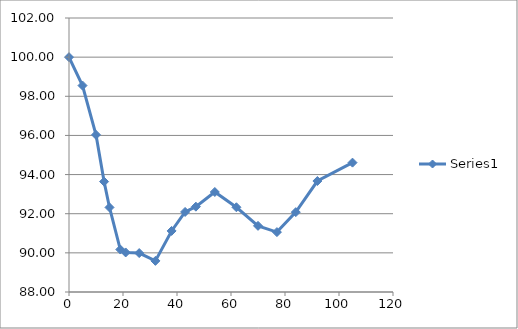
| Category | Series 0 |
|---|---|
| 0.0 | 100 |
| 5.0 | 98.55 |
| 10.0 | 96.03 |
| 13.0 | 93.64 |
| 15.0 | 92.32 |
| 19.0 | 90.17 |
| 21.0 | 90.02 |
| 26.0 | 89.99 |
| 32.0 | 89.59 |
| 38.0 | 91.12 |
| 43.0 | 92.09 |
| 47.0 | 92.36 |
| 54.0 | 93.11 |
| 62.0 | 92.33 |
| 70.0 | 91.38 |
| 77.0 | 91.06 |
| 84.0 | 92.08 |
| 92.0 | 93.67 |
| 105.0 | 94.61 |